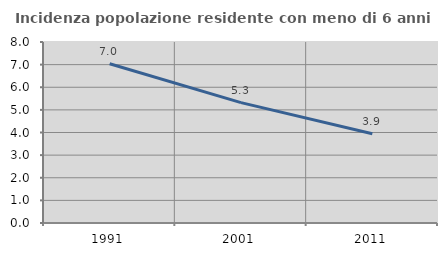
| Category | Incidenza popolazione residente con meno di 6 anni |
|---|---|
| 1991.0 | 7.037 |
| 2001.0 | 5.32 |
| 2011.0 | 3.942 |